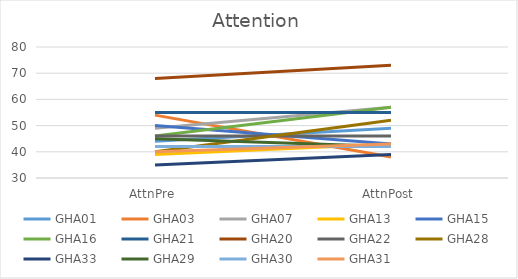
| Category | GHA01 | GHA03 | GHA07 | GHA13 | GHA15 | GHA16 | GHA21 | GHA20 | GHA22 | GHA28 | GHA33 | GHA29 | GHA30 | GHA31 |
|---|---|---|---|---|---|---|---|---|---|---|---|---|---|---|
| AttnPre | 44 | 54 | 49 | 39 | 50 | 46 | 55 | 68 | 46 | 40 | 35 | 45 | 42 | 40 |
| AttnPost | 49 | 38 | 57 | 43 | 43 | 57 | 55 | 73 | 46 | 52 | 39 | 42 | 42 | 43 |